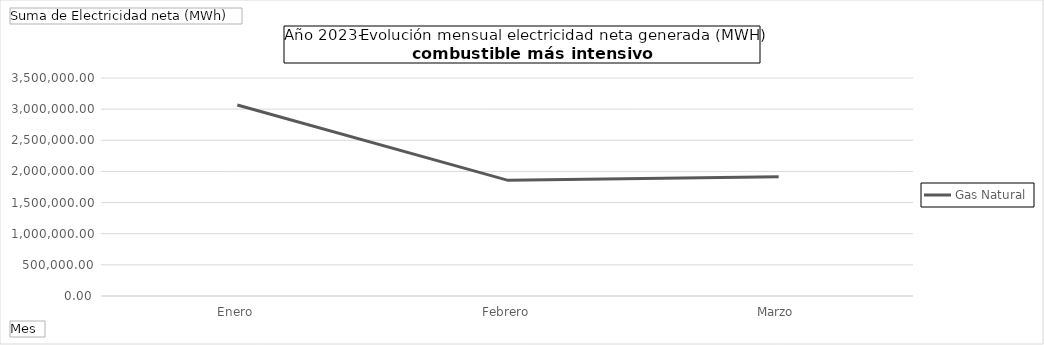
| Category | Gas Natural |
|---|---|
| Enero | 3067602.553 |
| Febrero | 1856625.627 |
| Marzo | 1913321.76 |